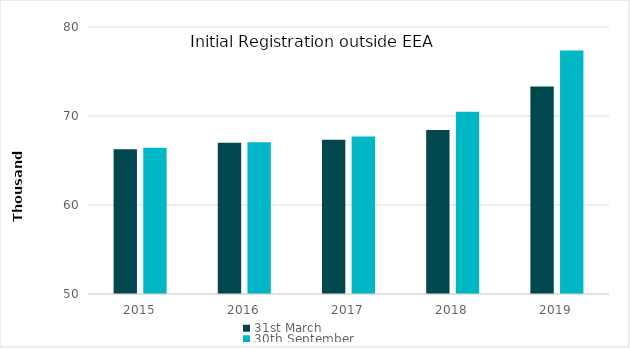
| Category | 31st March | 30th September |
|---|---|---|
| 2015.0 | 66251 | 66430 |
| 2016.0 | 66993 | 67055 |
| 2017.0 | 67345 | 67683 |
| 2018.0 | 68438 | 70491 |
| 2019.0 | 73308 | 77373 |